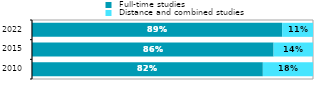
| Category |  Full-time studies |  Distance and combined studies |
|---|---|---|
| 2010.0 | 0.821 | 0.179 |
| 2015.0 | 0.86 | 0.14 |
| 2022.0 | 0.89 | 0.11 |